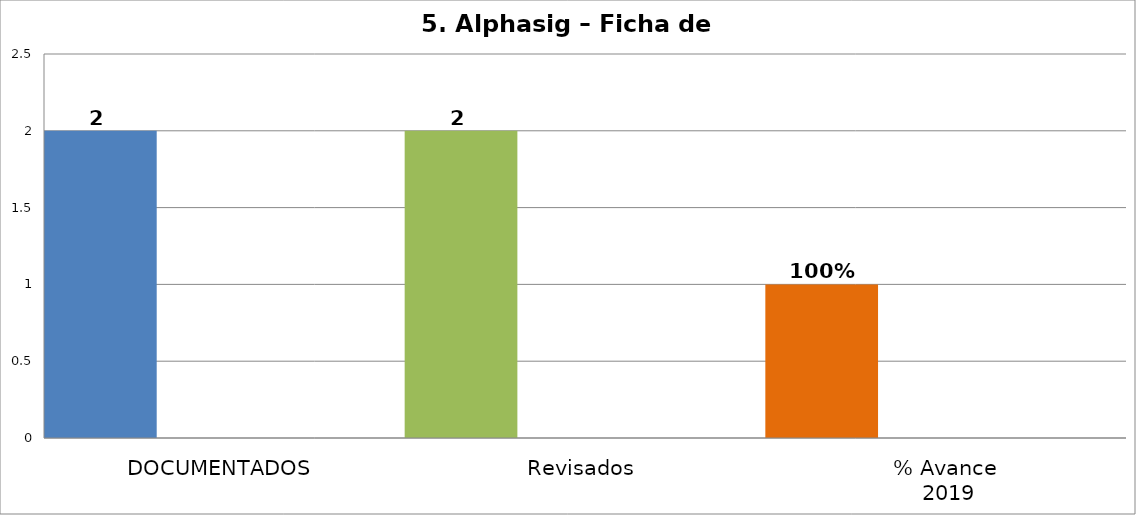
| Category | Series 0 | Series 1 | Series 2 | Series 3 | Series 4 |
|---|---|---|---|---|---|
| DOCUMENTADOS | 2 |  |  |  |  |
| Revisados | 2 |  |  |  |  |
| % Avance
 2019 | 1 |  |  |  |  |